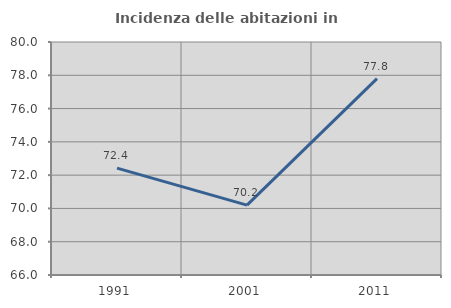
| Category | Incidenza delle abitazioni in proprietà  |
|---|---|
| 1991.0 | 72.422 |
| 2001.0 | 70.199 |
| 2011.0 | 77.802 |